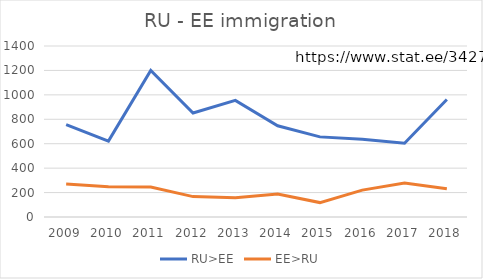
| Category | RU>EE | EE>RU |
|---|---|---|
| 2009.0 | 757 | 270 |
| 2010.0 | 622 | 247 |
| 2011.0 | 1200 | 245 |
| 2012.0 | 852 | 167 |
| 2013.0 | 955 | 157 |
| 2014.0 | 747 | 188 |
| 2015.0 | 656 | 118 |
| 2016.0 | 636 | 220 |
| 2017.0 | 604 | 279 |
| 2018.0 | 962 | 231 |